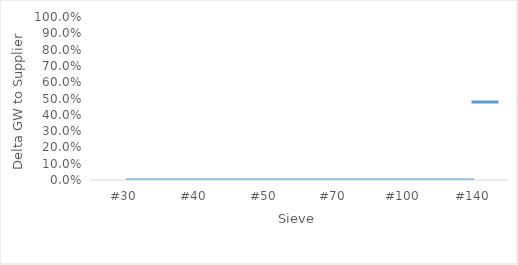
| Category | Series 0 |
|---|---|
| #30 | 0 |
| #40 | 0 |
| #50 | 0 |
| #70 | 0 |
| #100 | 0 |
| #140 | 0 |